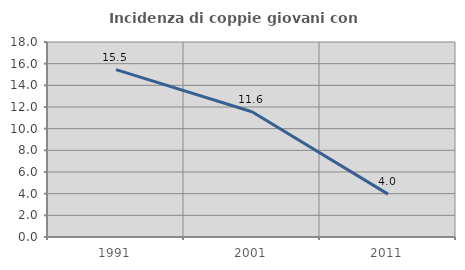
| Category | Incidenza di coppie giovani con figli |
|---|---|
| 1991.0 | 15.455 |
| 2001.0 | 11.558 |
| 2011.0 | 3.955 |